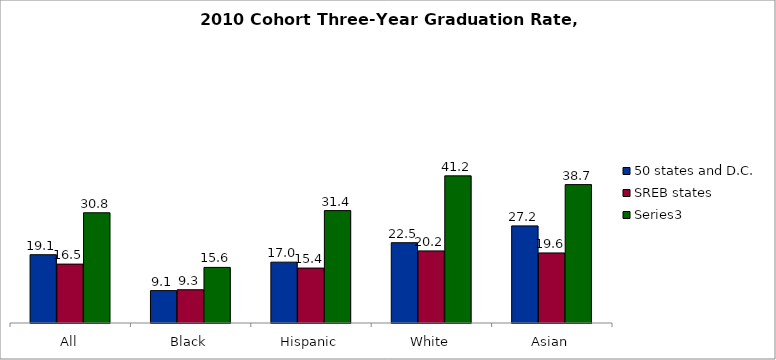
| Category | 50 states and D.C. | SREB states | Series 2 |
|---|---|---|---|
| All | 19.102 | 16.474 | 30.833 |
| Black | 9.059 | 9.301 | 15.552 |
| Hispanic | 17.016 | 15.366 | 31.436 |
| White | 22.46 | 20.163 | 41.161 |
| Asian | 27.161 | 19.596 | 38.71 |